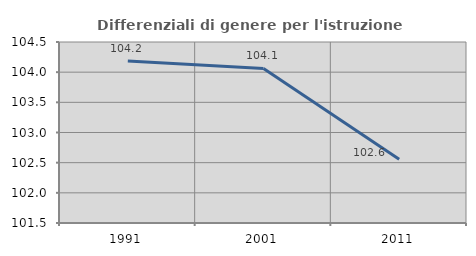
| Category | Differenziali di genere per l'istruzione superiore |
|---|---|
| 1991.0 | 104.185 |
| 2001.0 | 104.062 |
| 2011.0 | 102.558 |